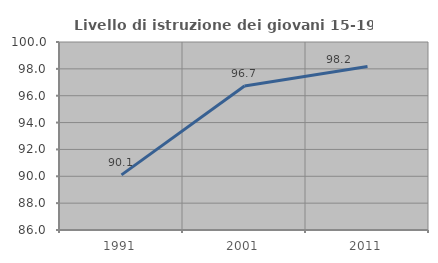
| Category | Livello di istruzione dei giovani 15-19 anni |
|---|---|
| 1991.0 | 90.103 |
| 2001.0 | 96.729 |
| 2011.0 | 98.176 |